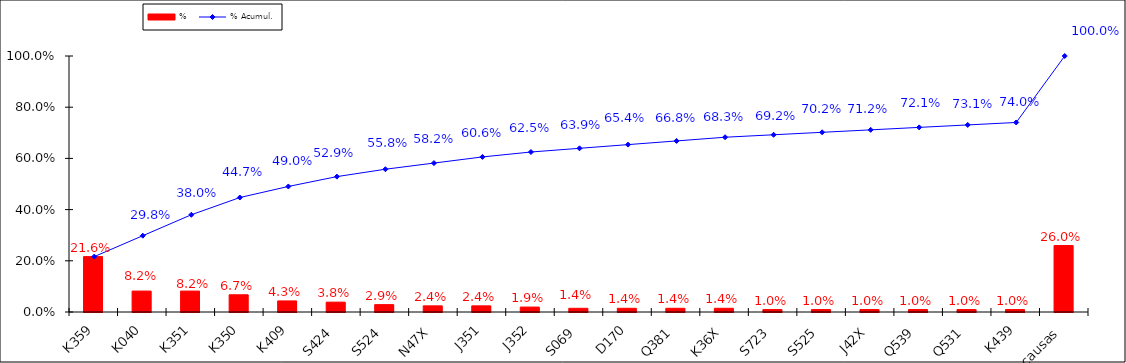
| Category | % |
|---|---|
| K359 | 0.216 |
| K040 | 0.082 |
| K351 | 0.082 |
| K350 | 0.067 |
| K409 | 0.043 |
| S424 | 0.038 |
| S524 | 0.029 |
| N47X | 0.024 |
| J351 | 0.024 |
| J352 | 0.019 |
| S069 | 0.014 |
| D170 | 0.014 |
| Q381 | 0.014 |
| K36X | 0.014 |
| S723 | 0.01 |
| S525 | 0.01 |
| J42X | 0.01 |
| Q539 | 0.01 |
| Q531 | 0.01 |
| K439 | 0.01 |
| Otras causas | 0.26 |